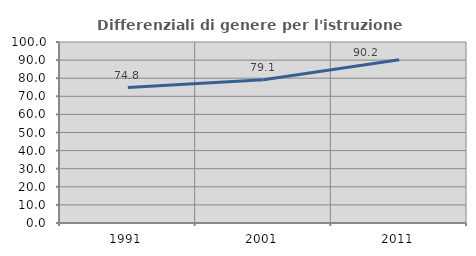
| Category | Differenziali di genere per l'istruzione superiore |
|---|---|
| 1991.0 | 74.832 |
| 2001.0 | 79.124 |
| 2011.0 | 90.165 |